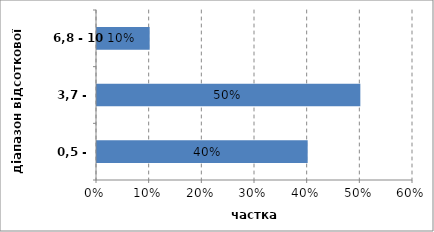
| Category | Series 0 |
|---|---|
| 0,5 - 3,7 | 0.4 |
| 3,7 - 6,8 | 0.5 |
| 6,8 - 10 | 0.1 |